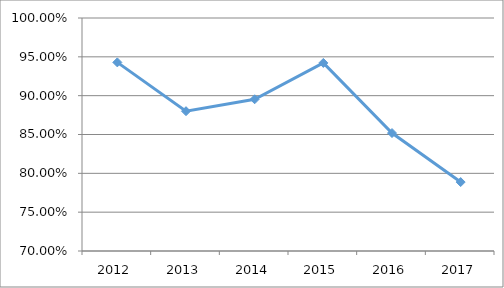
| Category | ETER-M6O29 |
|---|---|
| 2012.0 | 0.943 |
| 2013.0 | 0.88 |
| 2014.0 | 0.895 |
| 2015.0 | 0.942 |
| 2016.0 | 0.852 |
| 2017.0 | 0.789 |